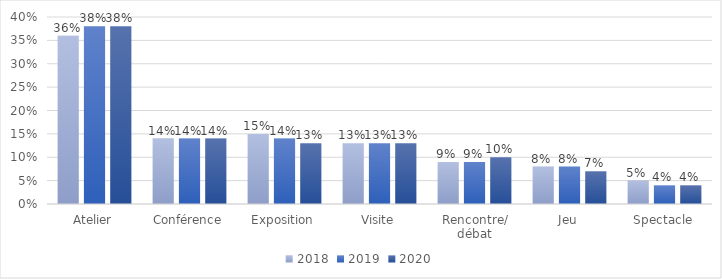
| Category | 2018 | 2019 | 2020 |
|---|---|---|---|
| Atelier | 0.36 | 0.38 | 0.38 |
| Conférence | 0.14 | 0.14 | 0.14 |
| Exposition | 0.15 | 0.14 | 0.13 |
| Visite | 0.13 | 0.13 | 0.13 |
| Rencontre/ débat | 0.09 | 0.09 | 0.1 |
| Jeu | 0.08 | 0.08 | 0.07 |
| Spectacle | 0.05 | 0.04 | 0.04 |